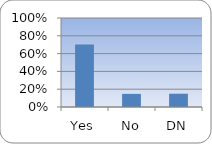
| Category | Series 0 |
|---|---|
| Yes | 0.703 |
| No | 0.147 |
| DN | 0.149 |